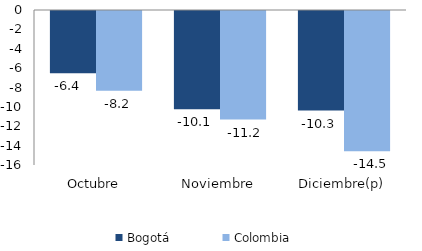
| Category | Bogotá | Colombia |
|---|---|---|
| Octubre | -6.434 | -8.221 |
| Noviembre | -10.141 | -11.204 |
| Diciembre(p) | -10.283 | -14.469 |